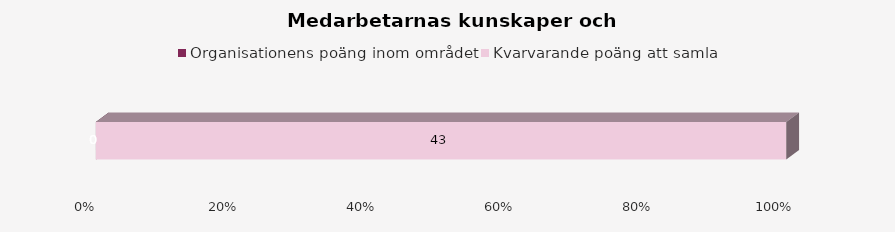
| Category | Organisationens poäng inom området | Kvarvarande poäng att samla |
|---|---|---|
| 0 | 0 | 43 |